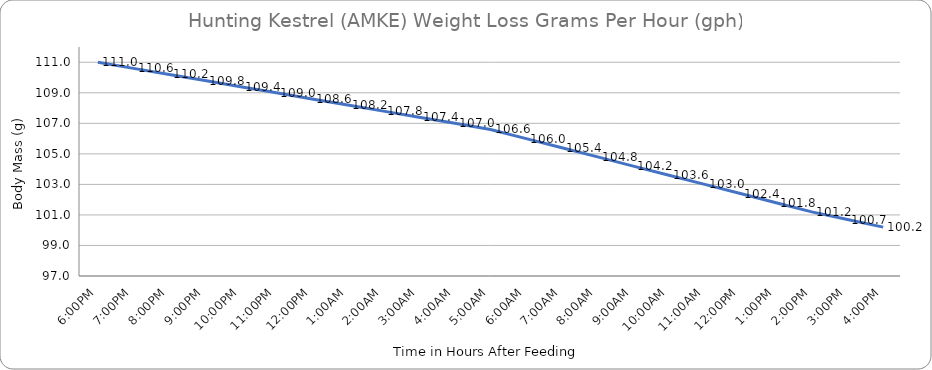
| Category | Series 0 |
|---|---|
| 6:00PM | 111 |
| 7:00PM | 110.6 |
| 8:00PM | 110.2 |
| 9:00PM | 109.8 |
| 10:00PM | 109.4 |
| 11:00PM | 109 |
| 12:00PM | 108.6 |
| 1:00AM | 108.2 |
| 2:00AM | 107.8 |
| 3:00AM | 107.4 |
| 4:00AM | 107 |
| 5:00AM | 106.6 |
| 6:00AM | 106 |
| 7:00AM | 105.4 |
| 8:00AM | 104.8 |
| 9:00AM | 104.2 |
| 10:00AM | 103.6 |
| 11:00AM | 103 |
| 12:00PM | 102.4 |
| 1:00PM | 101.8 |
| 2:00PM | 101.2 |
| 3:00PM | 100.7 |
| 4:00PM | 100.2 |